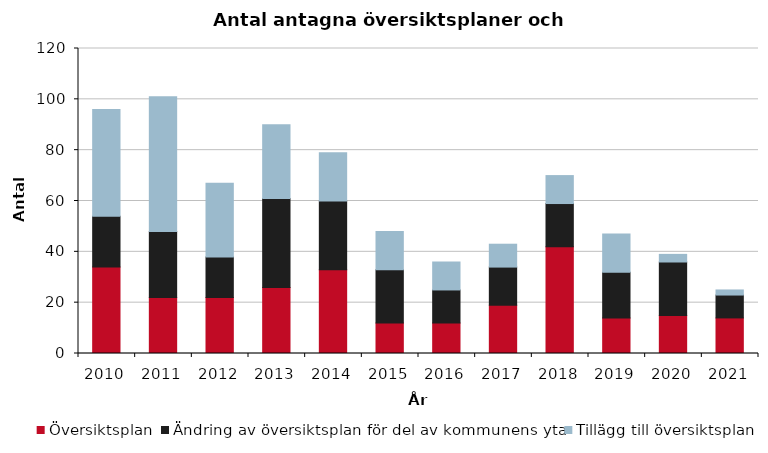
| Category | Översiktsplan | Ändring av översiktsplan för del av kommunens yta | Tillägg till översiktsplan |
|---|---|---|---|
| 2010.0 | 34 | 20 | 42 |
| 2011.0 | 22 | 26 | 53 |
| 2012.0 | 22 | 16 | 29 |
| 2013.0 | 26 | 35 | 29 |
| 2014.0 | 33 | 27 | 19 |
| 2015.0 | 12 | 21 | 15 |
| 2016.0 | 12 | 13 | 11 |
| 2017.0 | 19 | 15 | 9 |
| 2018.0 | 42 | 17 | 11 |
| 2019.0 | 14 | 18 | 15 |
| 2020.0 | 15 | 21 | 3 |
| 2021.0 | 14 | 9 | 2 |